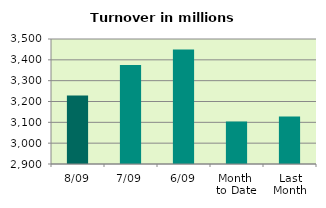
| Category | Series 0 |
|---|---|
| 8/09 | 3229.015 |
| 7/09 | 3374.684 |
| 6/09 | 3449.329 |
| Month 
to Date | 3103.906 |
| Last
Month | 3127.739 |